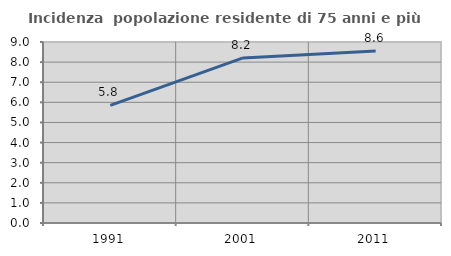
| Category | Incidenza  popolazione residente di 75 anni e più |
|---|---|
| 1991.0 | 5.849 |
| 2001.0 | 8.208 |
| 2011.0 | 8.55 |